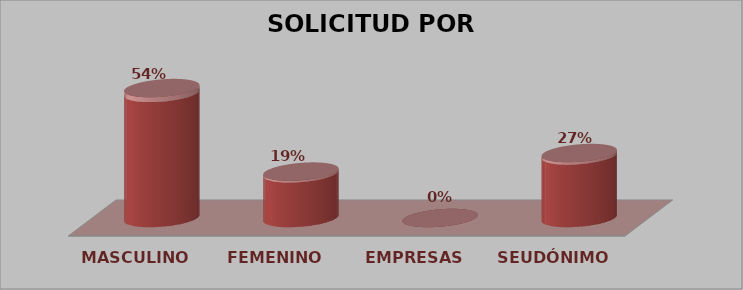
| Category | SOLICITUD POR GÉNERO | Series 1 |
|---|---|---|
| MASCULINO | 14 | 0.538 |
| FEMENINO | 5 | 0.192 |
| EMPRESAS | 0 | 0 |
| SEUDÓNIMO | 7 | 0.269 |